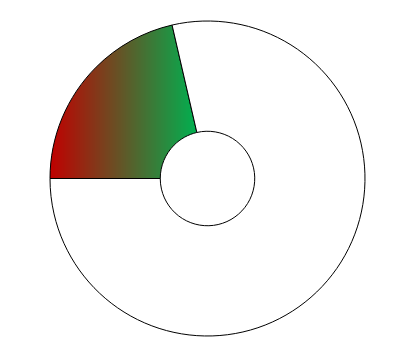
| Category | Series 0 |
|---|---|
| 0 | 77 |
| 1 | 283 |